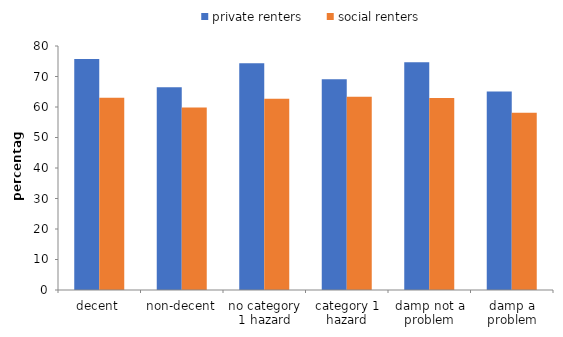
| Category | private renters | social renters |
|---|---|---|
| decent | 75.734 | 63.042 |
| non-decent | 66.472 | 59.851 |
| no category 1 hazard | 74.352 | 62.706 |
| category 1 hazard | 69.071 | 63.363 |
| damp not a problem | 74.671 | 62.944 |
| damp a problem | 65.067 | 58.146 |